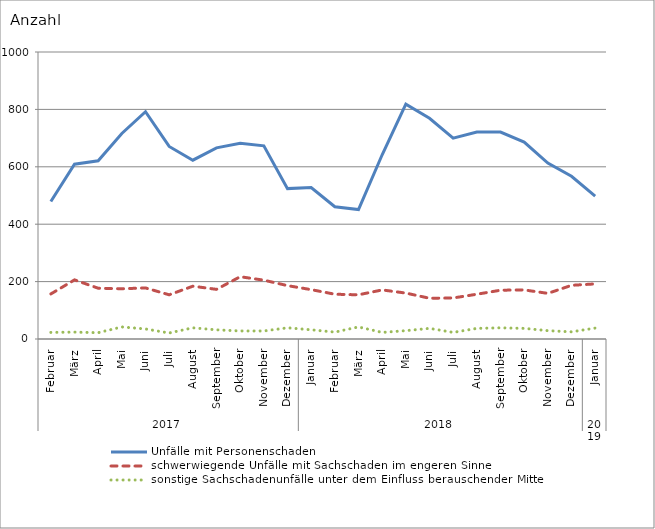
| Category | Unfälle mit Personenschaden | schwerwiegende Unfälle mit Sachschaden im engeren Sinne | sonstige Sachschadenunfälle unter dem Einfluss berauschender Mittel |
|---|---|---|---|
| 0 | 479 | 157 | 23 |
| 1 | 609 | 206 | 24 |
| 2 | 621 | 177 | 22 |
| 3 | 716 | 175 | 42 |
| 4 | 792 | 178 | 35 |
| 5 | 671 | 154 | 21 |
| 6 | 623 | 184 | 39 |
| 7 | 666 | 173 | 32 |
| 8 | 682 | 217 | 28 |
| 9 | 673 | 205 | 28 |
| 10 | 524 | 186 | 39 |
| 11 | 528 | 172 | 32 |
| 12 | 461 | 156 | 24 |
| 13 | 451 | 154 | 42 |
| 14 | 642 | 171 | 23 |
| 15 | 818 | 160 | 29 |
| 16 | 769 | 142 | 37 |
| 17 | 700 | 143 | 23 |
| 18 | 721 | 156 | 37 |
| 19 | 721 | 170 | 39 |
| 20 | 686 | 171 | 37 |
| 21 | 613 | 159 | 29 |
| 22 | 567 | 187 | 25 |
| 23 | 498 | 192 | 38 |